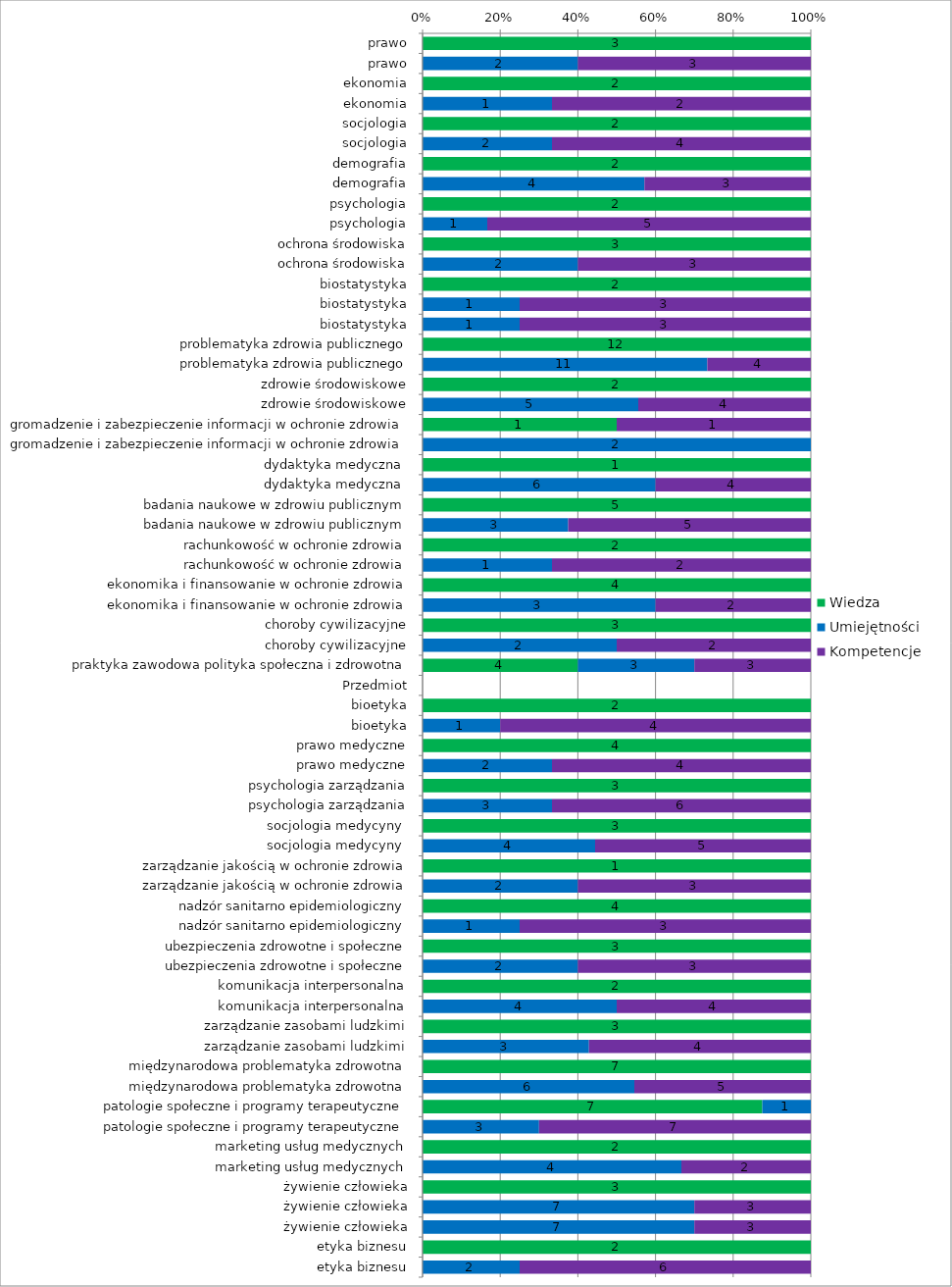
| Category | Wiedza | Umiejętności | Kompetencje |
|---|---|---|---|
|  prawo | 3 | 0 | 0 |
|  prawo | 0 | 2 | 3 |
|  ekonomia | 2 | 0 | 0 |
|  ekonomia | 0 | 1 | 2 |
|  socjologia | 2 | 0 | 0 |
|  socjologia | 0 | 2 | 4 |
|  demografia | 2 | 0 | 0 |
|  demografia | 0 | 4 | 3 |
|  psychologia | 2 | 0 | 0 |
|  psychologia | 0 | 1 | 5 |
|  ochrona środowiska | 3 | 0 | 0 |
|  ochrona środowiska | 0 | 2 | 3 |
|  biostatystyka | 2 | 0 | 0 |
|  biostatystyka | 0 | 1 | 3 |
|  biostatystyka | 0 | 1 | 3 |
| problematyka zdrowia publicznego | 12 | 0 | 0 |
| problematyka zdrowia publicznego | 0 | 11 | 4 |
|  zdrowie środowiskowe | 2 | 0 | 0 |
|  zdrowie środowiskowe | 0 | 5 | 4 |
| gromadzenie i zabezpieczenie informacji w ochronie zdrowia | 1 | 0 | 1 |
| gromadzenie i zabezpieczenie informacji w ochronie zdrowia | 0 | 2 | 0 |
| dydaktyka medyczna  | 1 | 0 | 0 |
| dydaktyka medyczna  | 0 | 6 | 4 |
| badania naukowe w zdrowiu publicznym | 5 | 0 | 0 |
| badania naukowe w zdrowiu publicznym | 0 | 3 | 5 |
| rachunkowość w ochronie zdrowia | 2 | 0 | 0 |
| rachunkowość w ochronie zdrowia | 0 | 1 | 2 |
| ekonomika i finansowanie w ochronie zdrowia | 4 | 0 | 0 |
| ekonomika i finansowanie w ochronie zdrowia | 0 | 3 | 2 |
| choroby cywilizacyjne | 3 | 0 | 0 |
| choroby cywilizacyjne | 0 | 2 | 2 |
| praktyka zawodowa polityka społeczna i zdrowotna | 4 | 3 | 3 |
| Przedmiot | 0 | 0 | 0 |
| bioetyka | 2 | 0 | 0 |
| bioetyka | 0 | 1 | 4 |
| prawo medyczne | 4 | 0 | 0 |
| prawo medyczne | 0 | 2 | 4 |
| psychologia zarządzania | 3 | 0 | 0 |
| psychologia zarządzania | 0 | 3 | 6 |
| socjologia medycyny  | 3 | 0 | 0 |
| socjologia medycyny  | 0 | 4 | 5 |
| zarządzanie jakością w ochronie zdrowia | 1 | 0 | 0 |
| zarządzanie jakością w ochronie zdrowia | 0 | 2 | 3 |
| nadzór sanitarno epidemiologiczny | 4 | 0 | 0 |
| nadzór sanitarno epidemiologiczny | 0 | 1 | 3 |
| ubezpieczenia zdrowotne i społeczne | 3 | 0 | 0 |
| ubezpieczenia zdrowotne i społeczne | 0 | 2 | 3 |
| komunikacja interpersonalna | 2 | 0 | 0 |
| komunikacja interpersonalna | 0 | 4 | 4 |
| zarządzanie zasobami ludzkimi | 3 | 0 | 0 |
| zarządzanie zasobami ludzkimi | 0 | 3 | 4 |
| międzynarodowa problematyka zdrowotna | 7 | 0 | 0 |
| międzynarodowa problematyka zdrowotna | 0 | 6 | 5 |
| patologie społeczne i programy terapeutyczne | 7 | 1 | 0 |
| patologie społeczne i programy terapeutyczne | 0 | 3 | 7 |
| marketing usług medycznych | 2 | 0 | 0 |
| marketing usług medycznych | 0 | 4 | 2 |
| żywienie człowieka | 3 | 0 | 0 |
| żywienie człowieka | 0 | 7 | 3 |
| żywienie człowieka | 0 | 7 | 3 |
| etyka biznesu | 2 | 0 | 0 |
| etyka biznesu | 0 | 2 | 6 |